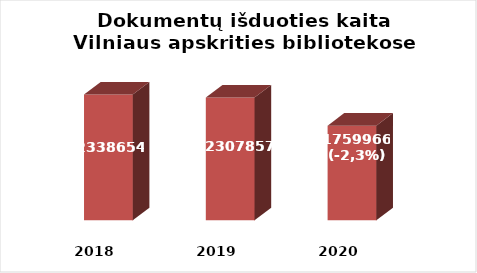
| Category | Series 0 |
|---|---|
| 2018.0 | 2338654 |
| 2019.0 | 2280866 |
| 2020.0 | 1759966 |